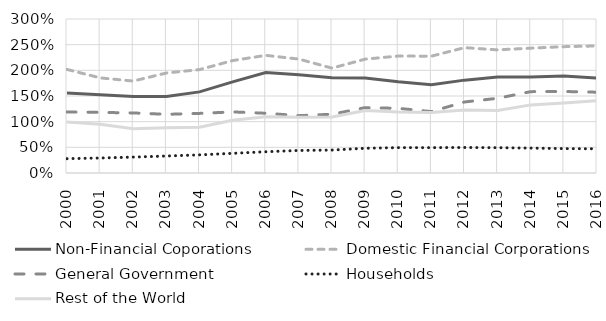
| Category | Non-Financial Coporations | Domestic Financial Corporations | General Government | Households | Rest of the World |
|---|---|---|---|---|---|
| 2000 | 1.56 | 2.018 | 1.19 | 0.279 | 0.993 |
| 2001 | 1.523 | 1.853 | 1.181 | 0.292 | 0.948 |
| 2002 | 1.491 | 1.791 | 1.17 | 0.31 | 0.861 |
| 2003 | 1.49 | 1.948 | 1.143 | 0.331 | 0.882 |
| 2004 | 1.58 | 2.014 | 1.161 | 0.353 | 0.891 |
| 2005 | 1.776 | 2.19 | 1.19 | 0.383 | 1.029 |
| 2006 | 1.959 | 2.292 | 1.164 | 0.414 | 1.096 |
| 2007 | 1.914 | 2.219 | 1.117 | 0.439 | 1.088 |
| 2008 | 1.857 | 2.043 | 1.145 | 0.447 | 1.092 |
| 2009 | 1.852 | 2.218 | 1.273 | 0.482 | 1.218 |
| 2010 | 1.777 | 2.278 | 1.26 | 0.494 | 1.19 |
| 2011 | 1.721 | 2.276 | 1.196 | 0.494 | 1.179 |
| 2012 | 1.809 | 2.442 | 1.384 | 0.497 | 1.228 |
| 2013 | 1.869 | 2.399 | 1.455 | 0.493 | 1.218 |
| 2014 | 1.869 | 2.432 | 1.585 | 0.485 | 1.327 |
| 2015 | 1.888 | 2.461 | 1.588 | 0.475 | 1.363 |
| 2016 | 1.848 | 2.475 | 1.574 | 0.472 | 1.409 |